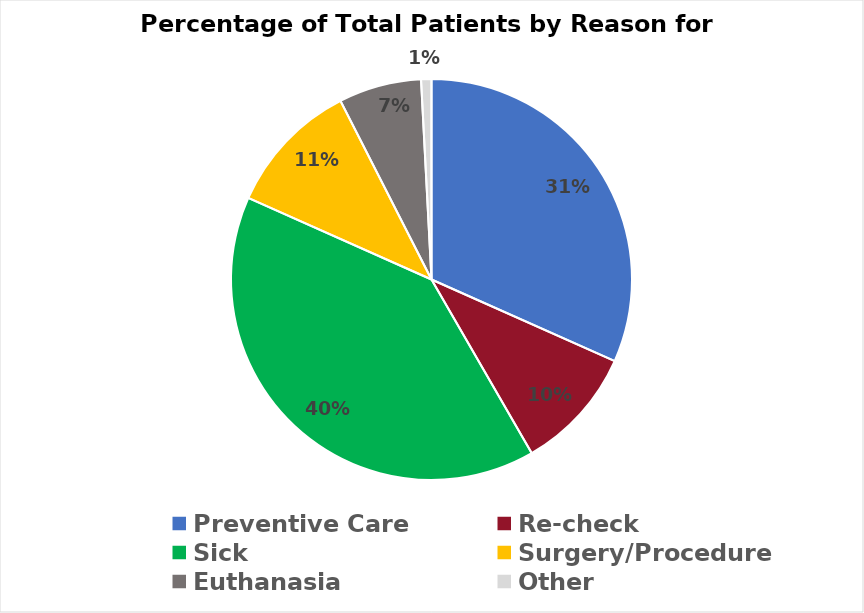
| Category | Series 0 |
|---|---|
| Preventive Care | 38 |
| Re-check | 12 |
| Sick | 48 |
| Surgery/Procedure | 13 |
| Euthanasia | 8 |
| Other | 1 |